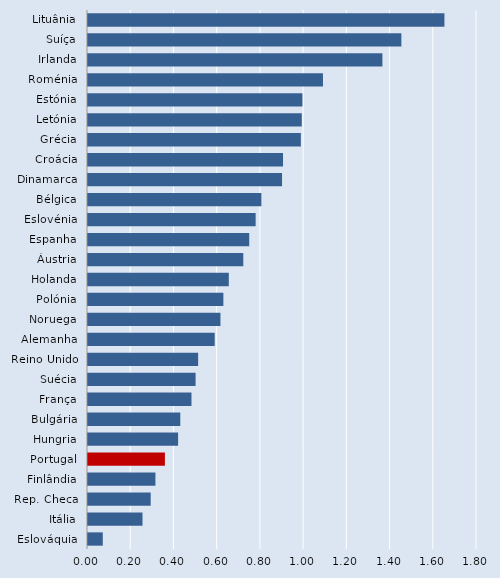
| Category | Series 0 |
|---|---|
| Lituânia | 1.649 |
| Suíça | 1.45 |
| Irlanda | 1.362 |
| Roménia | 1.087 |
| Estónia | 0.992 |
| Letónia | 0.989 |
| Grécia | 0.985 |
| Croácia | 0.902 |
| Dinamarca | 0.898 |
| Bélgica | 0.802 |
| Eslovénia | 0.776 |
| Espanha | 0.746 |
| Áustria | 0.719 |
| Holanda | 0.652 |
| Polónia | 0.626 |
| Noruega | 0.613 |
| Alemanha | 0.586 |
| Reino Unido | 0.51 |
| Suécia | 0.498 |
| França | 0.479 |
| Bulgária | 0.427 |
| Hungria | 0.417 |
| Portugal | 0.356 |
| Finlândia | 0.312 |
| Rep. Checa | 0.29 |
| Itália | 0.252 |
| Eslováquia | 0.068 |